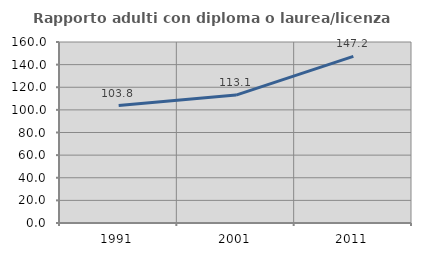
| Category | Rapporto adulti con diploma o laurea/licenza media  |
|---|---|
| 1991.0 | 103.774 |
| 2001.0 | 113.084 |
| 2011.0 | 147.244 |